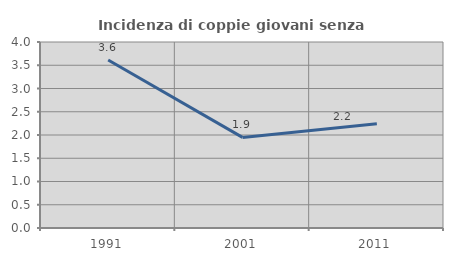
| Category | Incidenza di coppie giovani senza figli |
|---|---|
| 1991.0 | 3.614 |
| 2001.0 | 1.948 |
| 2011.0 | 2.244 |